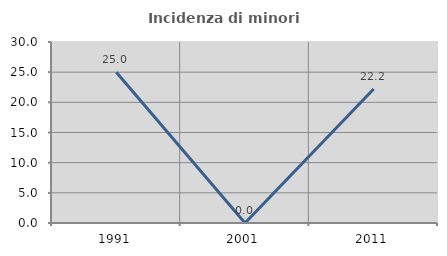
| Category | Incidenza di minori stranieri |
|---|---|
| 1991.0 | 25 |
| 2001.0 | 0 |
| 2011.0 | 22.222 |